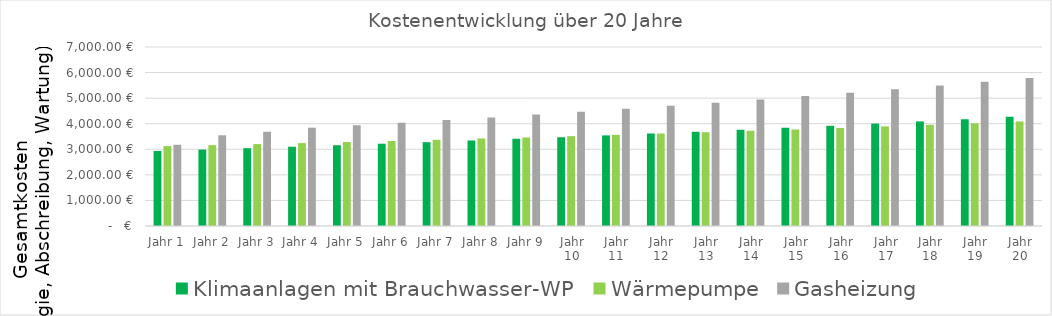
| Category | Klimaanlagen mit Brauchwasser-WP | Wärmepumpe | Gasheizung |
|---|---|---|---|
| Jahr 1 | 2935.821 | 3125.565 | 3176.564 |
| Jahr 2 | 2988.888 | 3163.7 | 3552.749 |
| Jahr 3 | 3043.546 | 3202.979 | 3686.414 |
| Jahr 4 | 3099.845 | 3243.437 | 3844.168 |
| Jahr 5 | 3157.832 | 3285.108 | 3940.648 |
| Jahr 6 | 3217.559 | 3328.029 | 4040.022 |
| Jahr 7 | 3279.078 | 3372.238 | 4142.378 |
| Jahr 8 | 3342.442 | 3417.773 | 4247.804 |
| Jahr 9 | 3407.707 | 3464.675 | 4356.393 |
| Jahr 10 | 3474.93 | 3512.983 | 4468.24 |
| Jahr 11 | 3544.17 | 3562.741 | 4583.442 |
| Jahr 12 | 3615.487 | 3613.991 | 4702.1 |
| Jahr 13 | 3688.944 | 3666.779 | 4824.318 |
| Jahr 14 | 3764.604 | 3721.151 | 4950.203 |
| Jahr 15 | 3842.534 | 3777.153 | 5079.864 |
| Jahr 16 | 3922.802 | 3834.836 | 5213.415 |
| Jahr 17 | 4005.478 | 3894.249 | 5350.972 |
| Jahr 18 | 4090.634 | 3955.445 | 5492.656 |
| Jahr 19 | 4178.345 | 4018.477 | 5638.591 |
| Jahr 20 | 4268.688 | 4083.399 | 5788.904 |